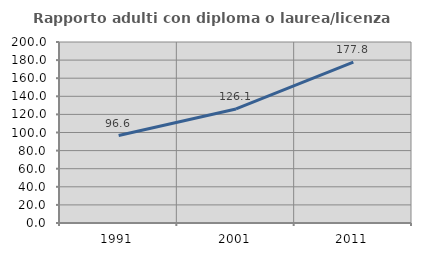
| Category | Rapporto adulti con diploma o laurea/licenza media  |
|---|---|
| 1991.0 | 96.636 |
| 2001.0 | 126.06 |
| 2011.0 | 177.829 |